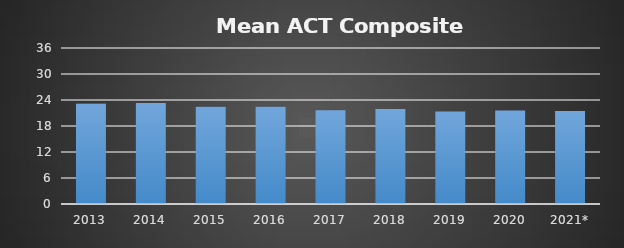
| Category | 23.06081081 |
|---|---|
| 2013 | 23.188 |
| 2014 | 23.319 |
| 2015 | 22.444 |
| 2016 | 22.444 |
| 2017 | 21.644 |
| 2018 | 21.949 |
| 2019 | 21.375 |
| 2020 | 21.593 |
| 2021* | 21.471 |